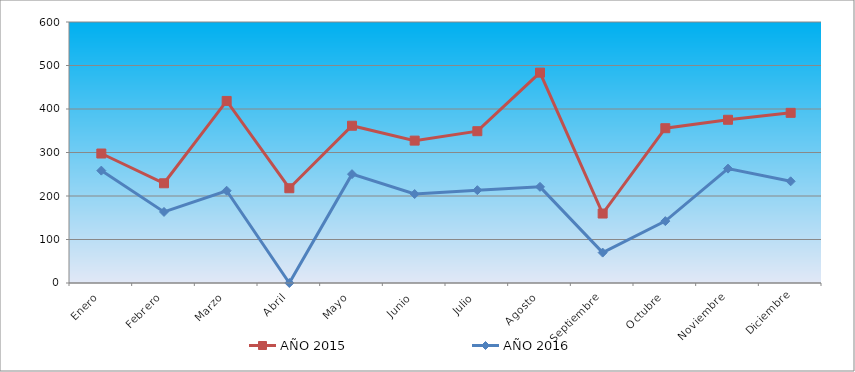
| Category | AÑO 2015 | AÑO 2016 |
|---|---|---|
| Enero | 297.664 | 258.351 |
| Febrero | 229.236 | 163.352 |
| Marzo | 418.555 | 212.135 |
| Abril | 217.831 | 0 |
| Mayo | 361.531 | 250.243 |
| Junio | 327.317 | 204.513 |
| Julio | 348.986 | 213.405 |
| Agosto | 483.562 | 221.026 |
| Septiembre | 159.667 | 69.865 |
| Octubre | 355.828 | 142.27 |
| Noviembre | 375.217 | 262.945 |
| Diciembre | 391.183 | 233.729 |